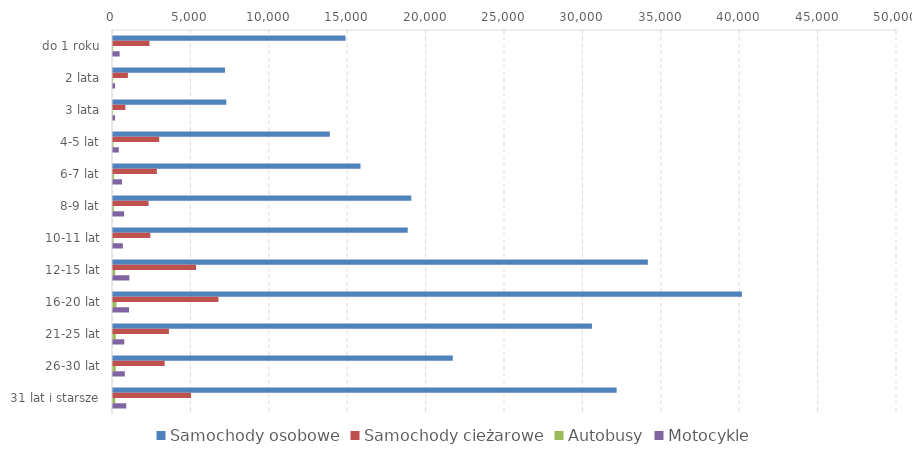
| Category | Samochody osobowe | Samochody cieżarowe | Autobusy | Motocykle |
|---|---|---|---|---|
| do 1 roku | 14832 | 2326 | 8 | 422 |
| 2 lata | 7142 | 950 | 10 | 130 |
| 3 lata | 7225 | 789 | 3 | 133 |
| 4-5 lat | 13828 | 2947 | 30 | 371 |
| 6-7 lat | 15783 | 2797 | 67 | 572 |
| 8-9 lat | 19023 | 2268 | 56 | 712 |
| 10-11 lat | 18796 | 2381 | 33 | 629 |
| 12-15 lat | 34109 | 5300 | 137 | 1046 |
| 16-20 lat | 40106 | 6725 | 219 | 1022 |
| 21-25 lat | 30545 | 3564 | 172 | 719 |
| 26-30 lat | 21670 | 3296 | 174 | 754 |
| 31 lat i starsze | 32117 | 4975 | 146 | 845 |